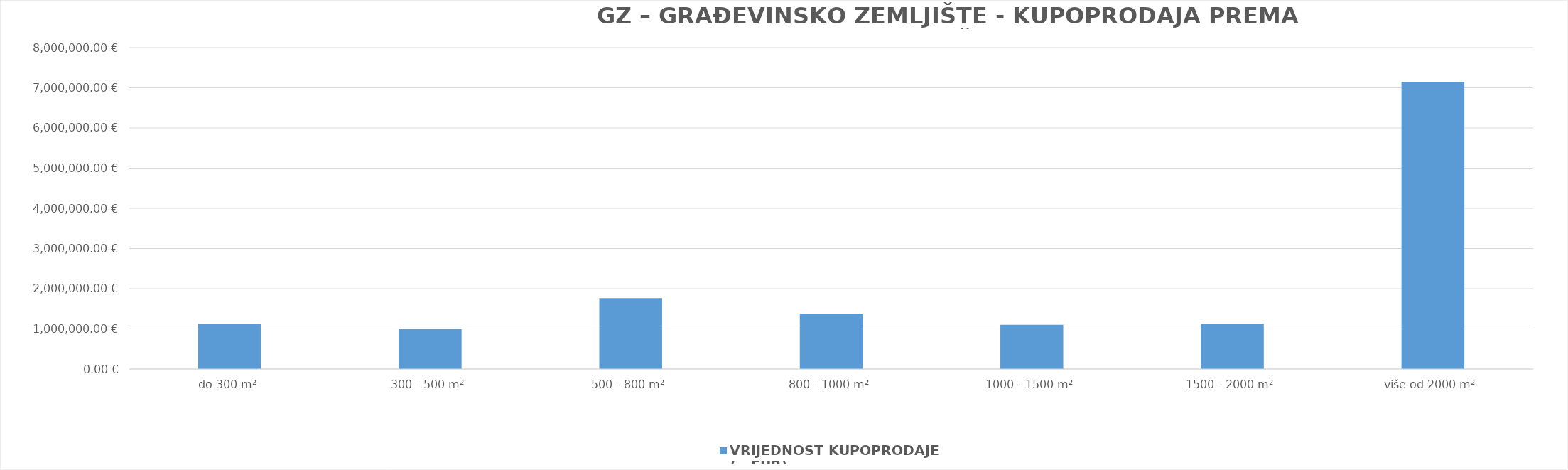
| Category | VRIJEDNOST KUPOPRODAJE (u EUR) |
|---|---|
| do 300 m² | 1119682.665 |
| 300 - 500 m² | 994691.48 |
| 500 - 800 m² | 1765837.222 |
| 800 - 1000 m² | 1375188.975 |
| 1000 - 1500 m² | 1100087.324 |
| 1500 - 2000 m² | 1128926.772 |
| više od 2000 m² | 7144009.943 |